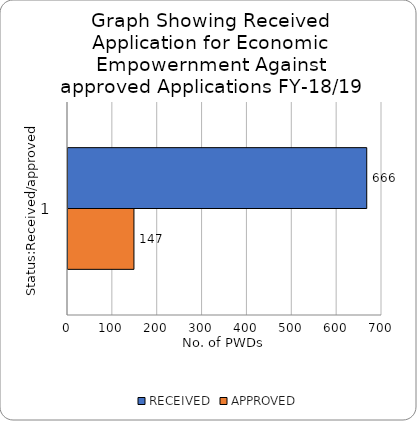
| Category | RECEIVED | APPROVED |
|---|---|---|
| 0 | 666 | 147 |